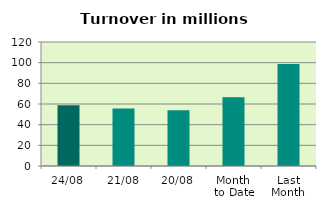
| Category | Series 0 |
|---|---|
| 24/08 | 58.682 |
| 21/08 | 55.536 |
| 20/08 | 53.936 |
| Month 
to Date | 66.577 |
| Last
Month | 98.668 |